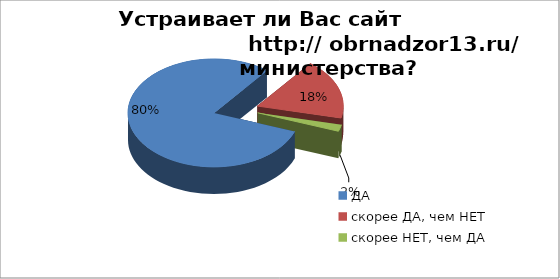
| Category | Устраивает ли Вас сайт министерства? |
|---|---|
| ДА | 0.8 |
| скорее ДА, чем НЕТ | 0.18 |
| скорее НЕТ, чем ДА | 0.02 |